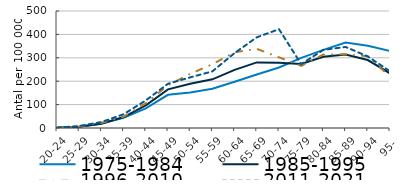
| Category | 1975-1984 | 1985-1995 | 1996-2010 | 2011-2021 |
|---|---|---|---|---|
| 20-24 | 0.735 | 0.857 | 0.865 | 1.433 |
| 25-29 | 5.585 | 5.373 | 6.273 | 8.568 |
| 30-34 | 19.501 | 18.033 | 21.78 | 25.427 |
| 35-39 | 43.546 | 46.657 | 48.581 | 58.821 |
| 40-44 | 84.141 | 97.002 | 105.644 | 117.799 |
| 45-49 | 141.982 | 165.177 | 182.788 | 189.12 |
| 50-54 | 151.517 | 188.764 | 231.336 | 216.344 |
| 55-59 | 168.141 | 208.005 | 272.503 | 241.964 |
| 60-64 | 197.735 | 248.436 | 323.638 | 320.389 |
| 65-69 | 228.711 | 280.3 | 338.3 | 387.44 |
| 70-74 | 258.477 | 279.279 | 302.077 | 422.299 |
| 75-79 | 299.721 | 273.361 | 265.463 | 272.998 |
| 80-84 | 333.724 | 304.442 | 313.996 | 333.924 |
| 85-89 | 365.163 | 314.268 | 315.09 | 346.33 |
| 90-94 | 351.843 | 290.396 | 306.882 | 305.764 |
| 95- | 329.086 | 233.42 | 218.83 | 242.323 |